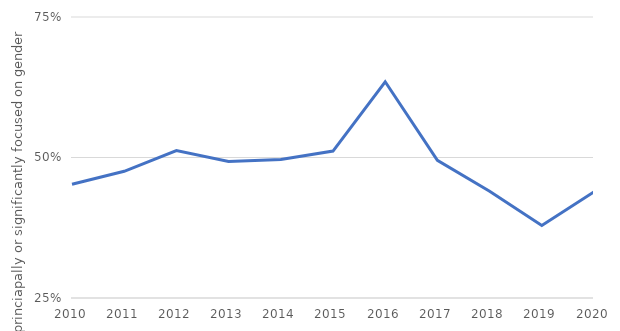
| Category | Series 0 |
|---|---|
| 2010 | 0.452 |
| 2011 | 0.475 |
| 2012 | 0.512 |
| 2013 | 0.493 |
| 2014 | 0.496 |
| 2015 | 0.511 |
| 2016 | 0.635 |
| 2017 | 0.495 |
| 2018 | 0.44 |
| 2019 | 0.379 |
| 2020 | 0.439 |